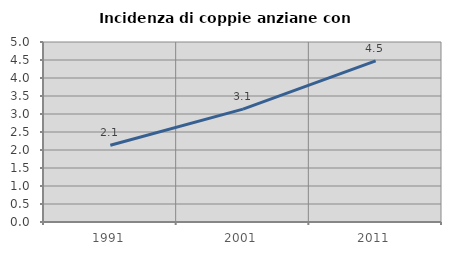
| Category | Incidenza di coppie anziane con figli |
|---|---|
| 1991.0 | 2.132 |
| 2001.0 | 3.136 |
| 2011.0 | 4.475 |